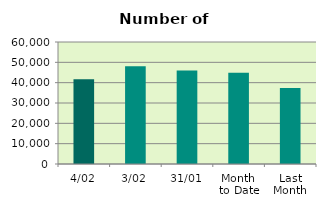
| Category | Series 0 |
|---|---|
| 4/02 | 41662 |
| 3/02 | 48094 |
| 31/01 | 45992 |
| Month 
to Date | 44878 |
| Last
Month | 37374.818 |